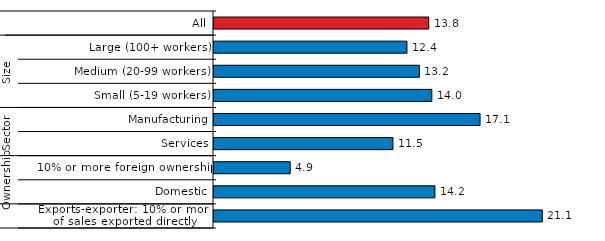
| Category | Series 0 |
|---|---|
| 0 | 13.8 |
| 1 | 12.4 |
| 2 | 13.2 |
| 3 | 14 |
| 4 | 17.1 |
| 5 | 11.5 |
| 6 | 4.9 |
| 7 | 14.2 |
| 8 | 21.1 |